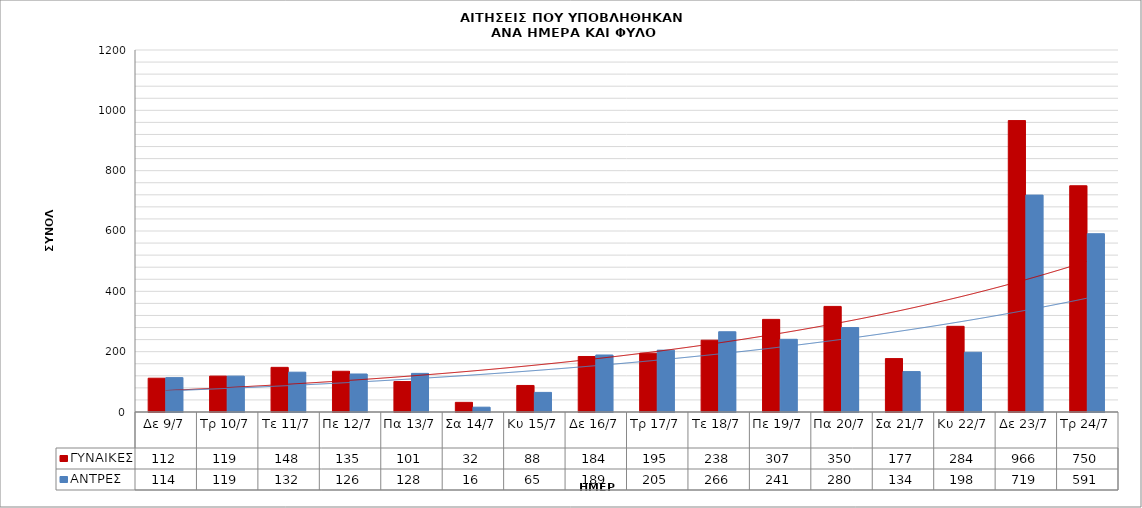
| Category | ΓΥΝΑΙΚΕΣ | ΑΝΤΡΕΣ |
|---|---|---|
| Δε 9/7 | 112 | 114 |
| Τρ 10/7 | 119 | 119 |
| Τε 11/7 | 148 | 132 |
| Πε 12/7 | 135 | 126 |
| Πα 13/7 | 101 | 128 |
| Σα 14/7 | 32 | 16 |
| Κυ 15/7 | 88 | 65 |
| Δε 16/7 | 184 | 189 |
| Τρ 17/7 | 195 | 205 |
| Τε 18/7 | 238 | 266 |
| Πε 19/7 | 307 | 241 |
| Πα 20/7 | 350 | 280 |
| Σα 21/7 | 177 | 134 |
| Κυ 22/7 | 284 | 198 |
| Δε 23/7 | 966 | 719 |
| Τρ 24/7 | 750 | 591 |